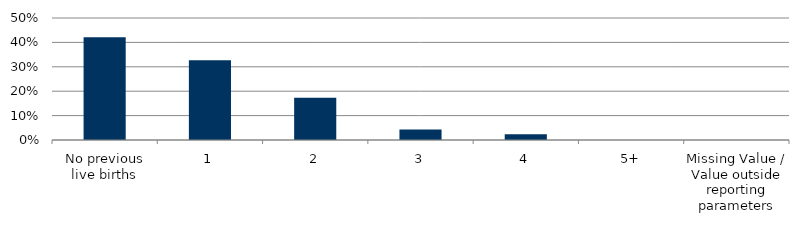
| Category | Total |
|---|---|
| No previous live births | 0.421 |
| 1 | 0.327 |
| 2 | 0.173 |
| 3 | 0.043 |
| 4 | 0.024 |
| 5+ | 0 |
| Missing Value / Value outside reporting parameters | 0 |